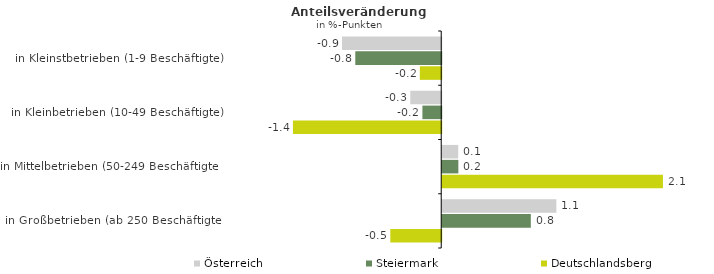
| Category | Österreich | Steiermark | Deutschlandsberg |
|---|---|---|---|
| in Kleinstbetrieben (1-9 Beschäftigte) | -0.926 | -0.802 | -0.2 |
| in Kleinbetrieben (10-49 Beschäftigte) | -0.289 | -0.176 | -1.385 |
| in Mittelbetrieben (50-249 Beschäftigte) | 0.149 | 0.151 | 2.061 |
| in Großbetrieben (ab 250 Beschäftigte) | 1.066 | 0.827 | -0.475 |